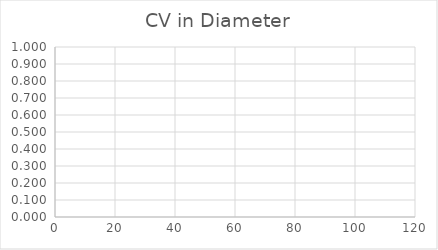
| Category | CV in Diameter |
|---|---|
| 3.0 | 0 |
| 4.0 | 0 |
| 5.0 | 0 |
| 6.0 | 0 |
| 7.0 | 0 |
| 8.0 | 0 |
| 9.0 | 0 |
| 10.0 | 0 |
| 11.0 | 0 |
| 12.0 | 0 |
| 13.0 | 0 |
| 14.0 | 0 |
| 15.0 | 0 |
| 16.0 | 0 |
| 17.0 | 0 |
| 18.0 | 0 |
| 19.0 | 0 |
| 20.0 | 0 |
| 21.0 | 0 |
| 22.0 | 0 |
| 23.0 | 0 |
| 24.0 | 0 |
| 25.0 | 0 |
| 26.0 | 0 |
| 27.0 | 0 |
| 28.0 | 0 |
| 29.0 | 0 |
| 30.0 | 0 |
| 31.0 | 0 |
| 32.0 | 0 |
| 33.0 | 0 |
| 34.0 | 0 |
| 35.0 | 0 |
| 36.0 | 0 |
| 37.0 | 0 |
| 38.0 | 0 |
| 39.0 | 0 |
| 40.0 | 0 |
| 41.0 | 0 |
| 42.0 | 0 |
| 43.0 | 0 |
| 44.0 | 0 |
| 45.0 | 0 |
| 46.0 | 0 |
| 47.0 | 0 |
| 48.0 | 0 |
| 49.0 | 0 |
| 50.0 | 0 |
| 51.0 | 0 |
| 52.0 | 0 |
| 53.0 | 0 |
| 54.0 | 0 |
| 55.0 | 0 |
| 56.0 | 0 |
| 57.0 | 0 |
| 58.0 | 0 |
| 59.0 | 0 |
| 60.0 | 0 |
| 61.0 | 0 |
| 62.0 | 0 |
| 63.0 | 0 |
| 64.0 | 0 |
| 65.0 | 0 |
| 66.0 | 0 |
| 67.0 | 0 |
| 68.0 | 0 |
| 69.0 | 0 |
| 70.0 | 0 |
| 71.0 | 0 |
| 72.0 | 0 |
| 73.0 | 0 |
| 74.0 | 0 |
| 75.0 | 0 |
| 76.0 | 0 |
| 77.0 | 0 |
| 78.0 | 0 |
| 79.0 | 0 |
| 80.0 | 0 |
| 81.0 | 0 |
| 82.0 | 0 |
| 83.0 | 0 |
| 84.0 | 0 |
| 85.0 | 0 |
| 86.0 | 0 |
| 87.0 | 0 |
| 88.0 | 0 |
| 89.0 | 0 |
| 90.0 | 0 |
| 91.0 | 0 |
| 92.0 | 0 |
| 93.0 | 0 |
| 94.0 | 0 |
| 95.0 | 0 |
| 96.0 | 0 |
| 97.0 | 0 |
| 98.0 | 0 |
| 99.0 | 0 |
| 100.0 | 0 |